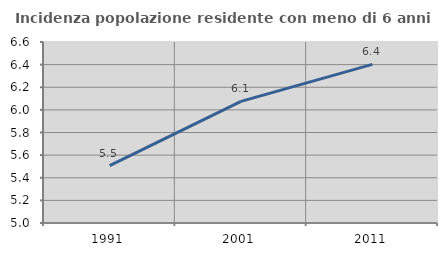
| Category | Incidenza popolazione residente con meno di 6 anni |
|---|---|
| 1991.0 | 5.508 |
| 2001.0 | 6.075 |
| 2011.0 | 6.402 |